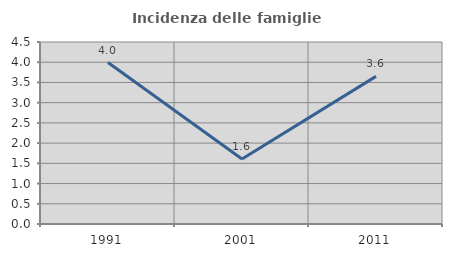
| Category | Incidenza delle famiglie numerose |
|---|---|
| 1991.0 | 3.991 |
| 2001.0 | 1.606 |
| 2011.0 | 3.65 |